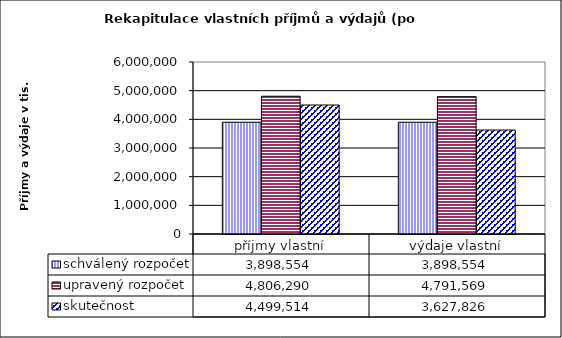
| Category | schválený rozpočet | upravený rozpočet | skutečnost |
|---|---|---|---|
| příjmy vlastní | 3898554 | 4806290 | 4499514 |
| výdaje vlastní | 3898554 | 4791569 | 3627826 |